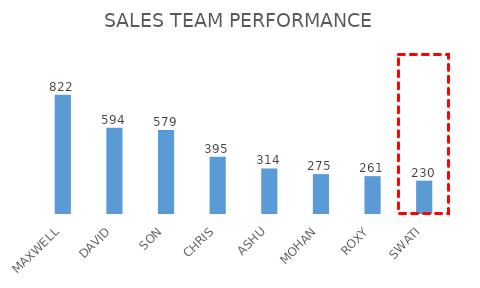
| Category | Series 0 |
|---|---|
| MAXWELL | 822 |
| DAVID | 594 |
| SON | 579 |
| CHRIS | 395 |
| ASHU | 314 |
| MOHAN | 275 |
| ROXY | 261 |
| SWATI | 230 |